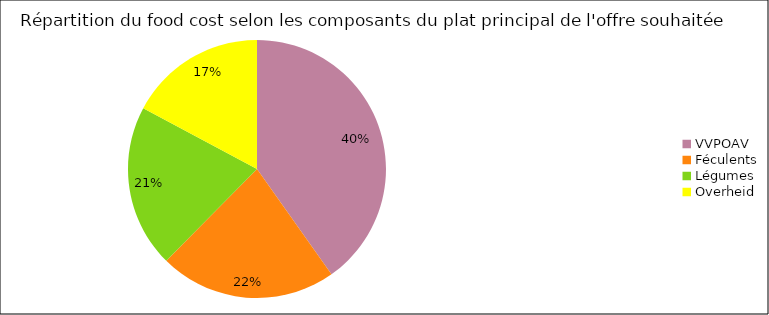
| Category | Series 0 |
|---|---|
| VVPOAV | 0.402 |
| Féculents | 0.222 |
| Légumes | 0.204 |
| Overheid | 0.172 |